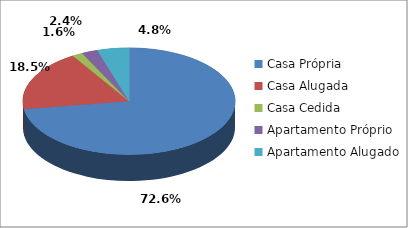
| Category | Series 0 |
|---|---|
| Casa Própria | 90 |
| Casa Alugada | 23 |
| Casa Cedida | 2 |
| Apartamento Próprio | 3 |
| Apartamento Alugado | 6 |